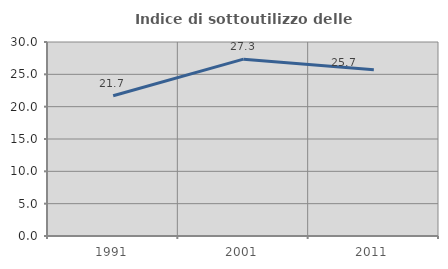
| Category | Indice di sottoutilizzo delle abitazioni  |
|---|---|
| 1991.0 | 21.689 |
| 2001.0 | 27.345 |
| 2011.0 | 25.704 |